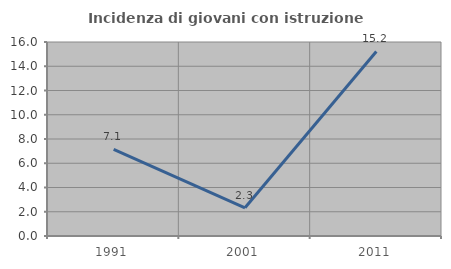
| Category | Incidenza di giovani con istruzione universitaria |
|---|---|
| 1991.0 | 7.143 |
| 2001.0 | 2.326 |
| 2011.0 | 15.217 |